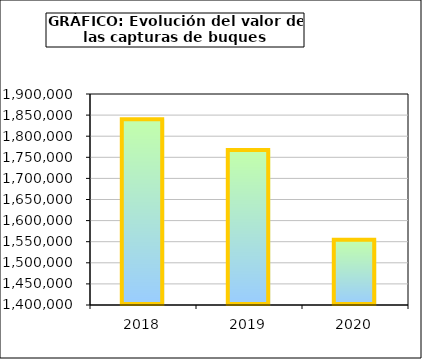
| Category | Series1 |
|---|---|
| 2018.0 | 1839877.98 |
| 2019.0 | 1767392.171 |
| 2020.0 | 1554414.547 |